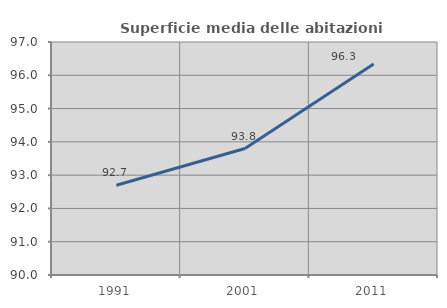
| Category | Superficie media delle abitazioni occupate |
|---|---|
| 1991.0 | 92.695 |
| 2001.0 | 93.799 |
| 2011.0 | 96.338 |